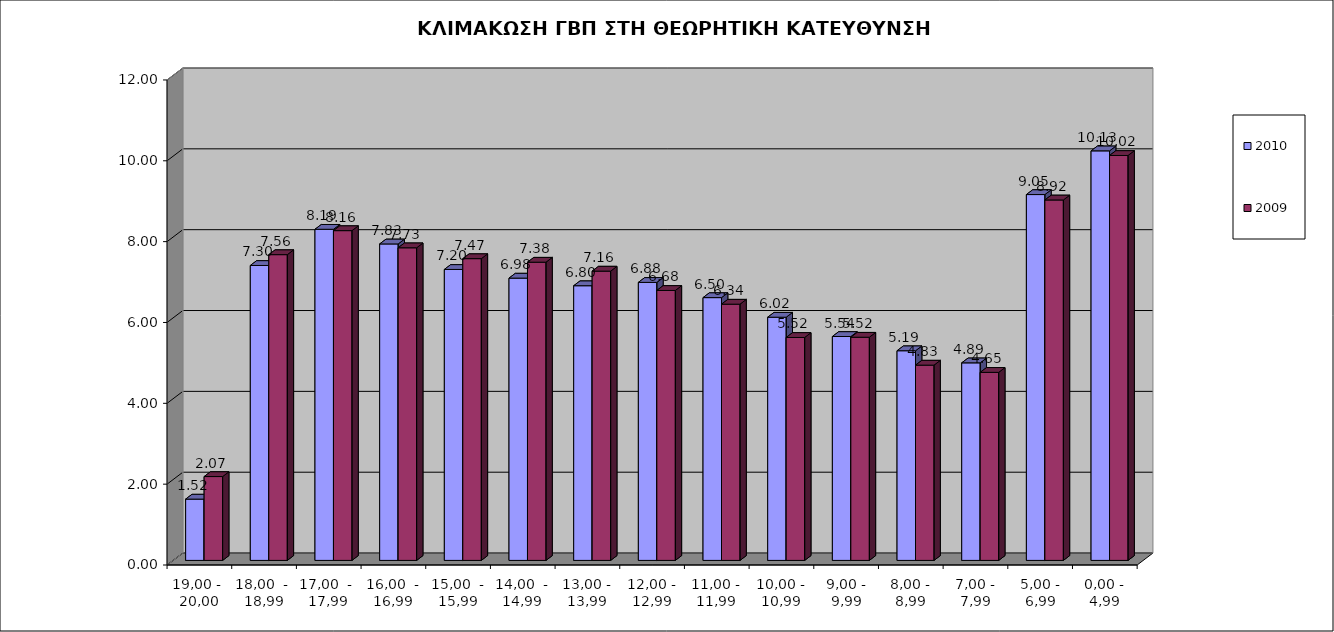
| Category | 2010 | 2009 |
|---|---|---|
| 19,00 -  20,00 | 1.516 | 2.074 |
| 18,00  -  18,99 | 7.296 | 7.564 |
| 17,00  -  17,99 | 8.192 | 8.158 |
| 16,00  - 16,99 | 7.829 | 7.734 |
| 15,00  - 15,99 | 7.198 | 7.465 |
| 14,00  - 14,99 | 6.983 | 7.377 |
| 13,00 - 13,99 | 6.795 | 7.157 |
| 12,00 - 12,99 | 6.877 | 6.678 |
| 11,00 - 11,99 | 6.501 | 6.339 |
| 10,00 - 10,99 | 6.016 | 5.515 |
| 9,00 - 9,99 | 5.539 | 5.521 |
| 8,00 - 8,99 | 5.187 | 4.83 |
| 7,00 - 7,99 | 4.887 | 4.652 |
| 5,00 - 6,99 | 9.051 | 8.917 |
| 0,00 - 4,99 | 10.132 | 10.018 |